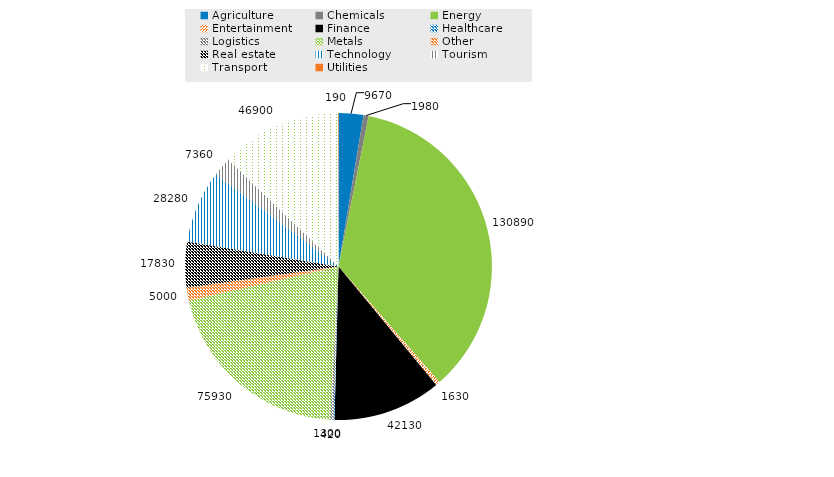
| Category | Series 0 |
|---|---|
| Agriculture | 9670 |
| Chemicals | 1980 |
| Energy | 130890 |
| Entertainment | 1630 |
| Finance | 42130 |
| Healthcare | 420 |
| Logistics | 1300 |
| Metals | 75930 |
| Other | 5000 |
| Real estate | 17830 |
| Technology | 28280 |
| Tourism | 7360 |
| Transport | 46900 |
| Utilities | 190 |